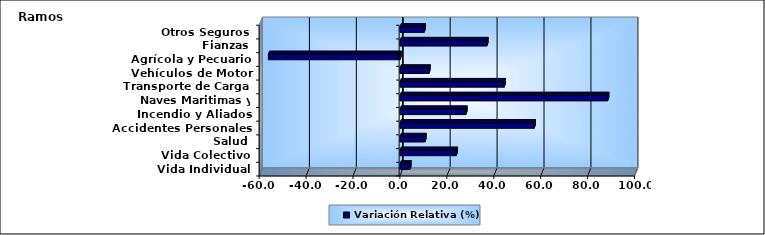
| Category | Variación Relativa (%) |
|---|---|
| Vida Individual | 4.235 |
| Vida Colectivo | 23.96 |
| Salud | 10.624 |
| Accidentes Personales | 57.208 |
| Incendio y Aliados | 28.088 |
| Naves Maritimas y Aéreas | 88.517 |
| Transporte de Carga | 44.428 |
| Vehículos de Motor | 12.349 |
| Agrícola y Pecuario | -56.097 |
| Fianzas | 37.029 |
| Otros Seguros | 10.328 |